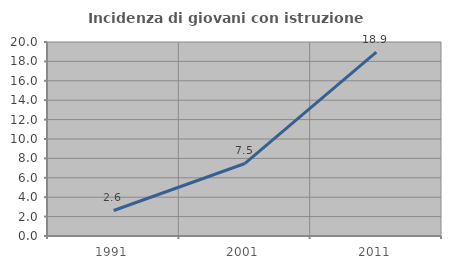
| Category | Incidenza di giovani con istruzione universitaria |
|---|---|
| 1991.0 | 2.632 |
| 2001.0 | 7.477 |
| 2011.0 | 18.947 |